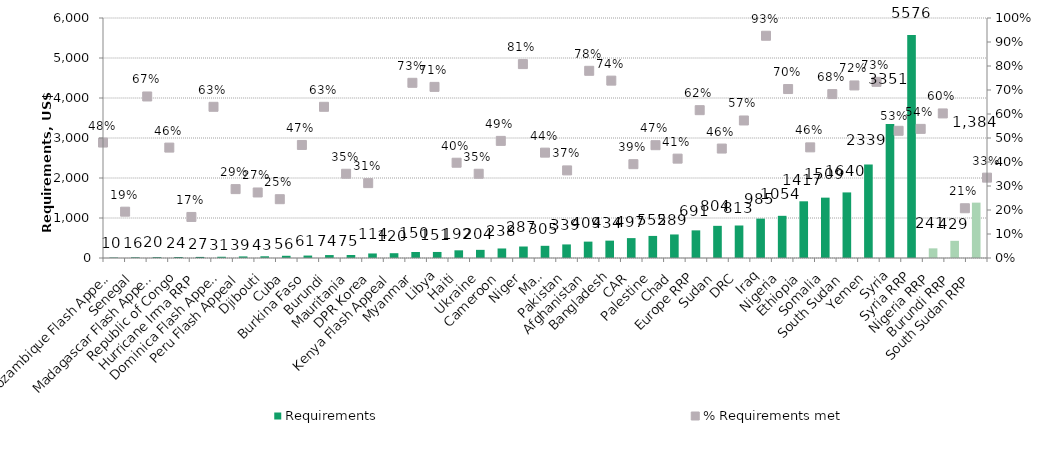
| Category | Requirements |
|---|---|
| Mozambique Flash Appeal | 10.246 |
| Senegal | 15.809 |
| Madagascar Flash Appeal | 20.068 |
| Republic of Congo | 23.7 |
| Hurricane Irma RRP | 27.054 |
| Dominica Flash Appeal | 31.117 |
| Peru Flash Appeal | 39.472 |
| Djibouti | 42.978 |
| Cuba | 55.572 |
| Burkina Faso | 61.089 |
| Burundi | 73.7 |
| Mauritania | 74.5 |
| DPR Korea | 113.503 |
| Kenya Flash Appeal | 119.865 |
| Myanmar | 150.3 |
| Libya | 151.013 |
| Haiti | 192.224 |
| Ukraine | 203.609 |
| Cameroon | 238.095 |
| Niger | 287.274 |
| Mali | 304.734 |
| Pakistan | 339.404 |
| Afghanistan | 409.414 |
| Bangladesh | 434.072 |
| CAR | 497.3 |
| Palestine | 551.877 |
| Chad | 588.608 |
| Europe RRP | 690.936 |
| Sudan | 803.966 |
| DRC | 812.614 |
| Iraq | 984.647 |
| Nigeria | 1054.431 |
| Ethiopia | 1417.4 |
| Somalia | 1508.83 |
| South Sudan | 1639.695 |
| Yemen | 2338.796 |
| Syria | 3351.304 |
| Syria RRP | 5575.937 |
| Nigeria RRP | 241.157 |
| Burundi RRP | 429.31 |
| South Sudan RRP | 1383.972 |